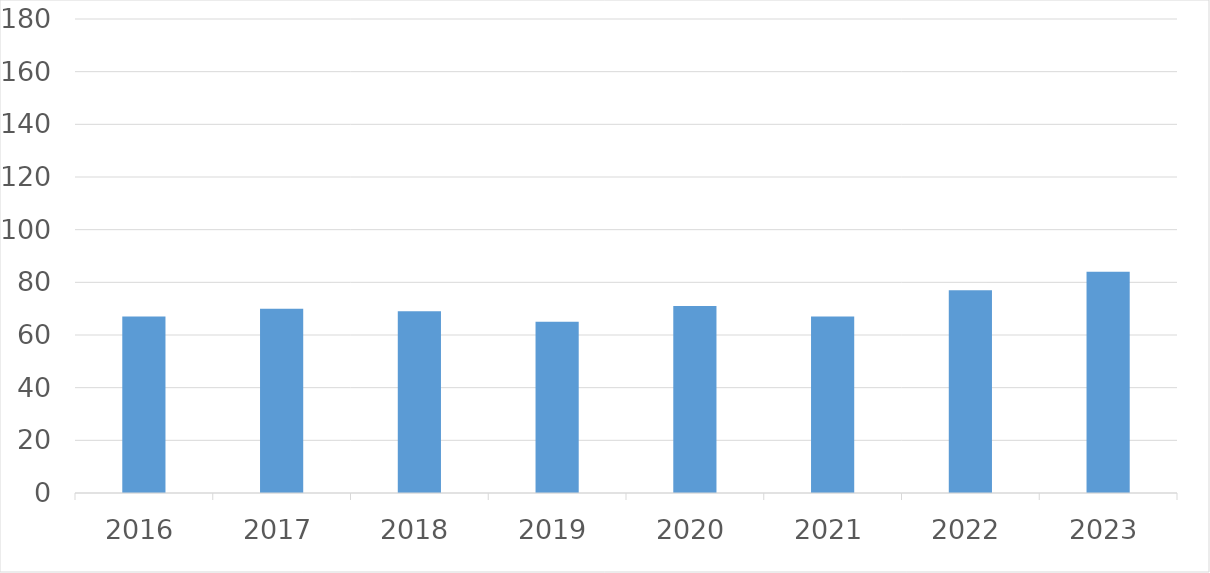
| Category | Series 0 |
|---|---|
| 2016 | 67 |
| 2017 | 70 |
| 2018 | 69 |
| 2019 | 65 |
| 2020 | 71 |
| 2021 | 67 |
| 2022 | 77 |
| 2023 | 84 |